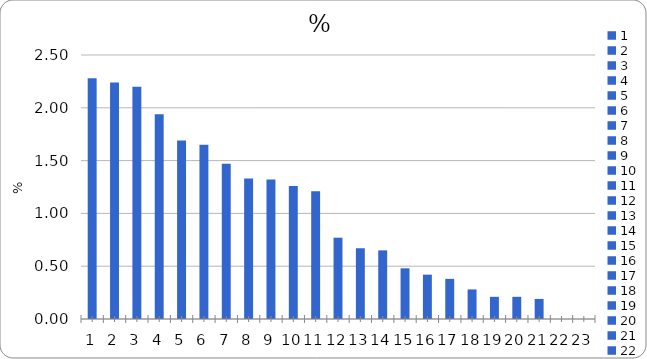
| Category | % |
|---|---|
| 0 | 2.28 |
| 1 | 2.24 |
| 2 | 2.2 |
| 3 | 1.94 |
| 4 | 1.69 |
| 5 | 1.65 |
| 6 | 1.47 |
| 7 | 1.33 |
| 8 | 1.32 |
| 9 | 1.26 |
| 10 | 1.21 |
| 11 | 0.77 |
| 12 | 0.67 |
| 13 | 0.65 |
| 14 | 0.48 |
| 15 | 0.42 |
| 16 | 0.38 |
| 17 | 0.28 |
| 18 | 0.21 |
| 19 | 0.21 |
| 20 | 0.19 |
| 21 | 0 |
| 22 | 0 |